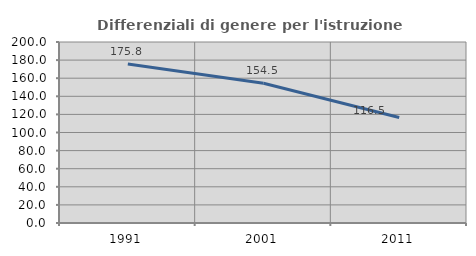
| Category | Differenziali di genere per l'istruzione superiore |
|---|---|
| 1991.0 | 175.795 |
| 2001.0 | 154.497 |
| 2011.0 | 116.507 |